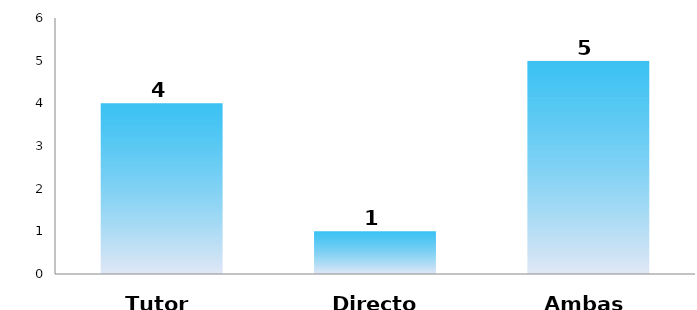
| Category | Series 0 |
|---|---|
| Tutor | 4 |
| Director | 1 |
| Ambas | 5 |